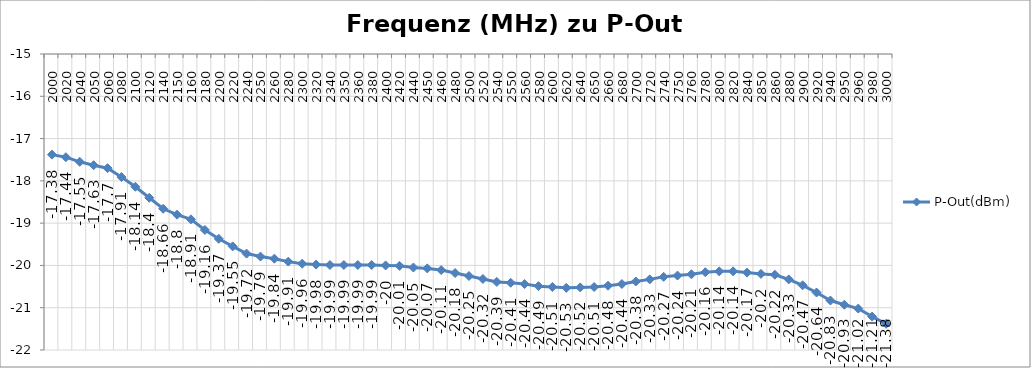
| Category | P-Out(dBm) |
|---|---|
| 2000.0 | -17.38 |
| 2020.0 | -17.44 |
| 2040.0 | -17.55 |
| 2050.0 | -17.63 |
| 2060.0 | -17.7 |
| 2080.0 | -17.91 |
| 2100.0 | -18.14 |
| 2120.0 | -18.4 |
| 2140.0 | -18.66 |
| 2150.0 | -18.8 |
| 2160.0 | -18.91 |
| 2180.0 | -19.16 |
| 2200.0 | -19.37 |
| 2220.0 | -19.55 |
| 2240.0 | -19.72 |
| 2250.0 | -19.79 |
| 2260.0 | -19.84 |
| 2280.0 | -19.91 |
| 2300.0 | -19.96 |
| 2320.0 | -19.98 |
| 2340.0 | -19.99 |
| 2350.0 | -19.99 |
| 2360.0 | -19.99 |
| 2380.0 | -19.99 |
| 2400.0 | -20 |
| 2420.0 | -20.01 |
| 2440.0 | -20.05 |
| 2450.0 | -20.07 |
| 2460.0 | -20.11 |
| 2480.0 | -20.18 |
| 2500.0 | -20.25 |
| 2520.0 | -20.32 |
| 2540.0 | -20.39 |
| 2550.0 | -20.41 |
| 2560.0 | -20.44 |
| 2580.0 | -20.49 |
| 2600.0 | -20.51 |
| 2620.0 | -20.53 |
| 2640.0 | -20.52 |
| 2650.0 | -20.51 |
| 2660.0 | -20.48 |
| 2680.0 | -20.44 |
| 2700.0 | -20.38 |
| 2720.0 | -20.33 |
| 2740.0 | -20.27 |
| 2750.0 | -20.24 |
| 2760.0 | -20.21 |
| 2780.0 | -20.16 |
| 2800.0 | -20.14 |
| 2820.0 | -20.14 |
| 2840.0 | -20.17 |
| 2850.0 | -20.2 |
| 2860.0 | -20.22 |
| 2880.0 | -20.33 |
| 2900.0 | -20.47 |
| 2920.0 | -20.64 |
| 2940.0 | -20.83 |
| 2950.0 | -20.93 |
| 2960.0 | -21.02 |
| 2980.0 | -21.21 |
| 3000.0 | -21.38 |